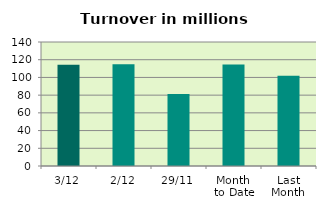
| Category | Series 0 |
|---|---|
| 3/12 | 114.184 |
| 2/12 | 114.944 |
| 29/11 | 81.163 |
| Month 
to Date | 114.564 |
| Last
Month | 101.866 |